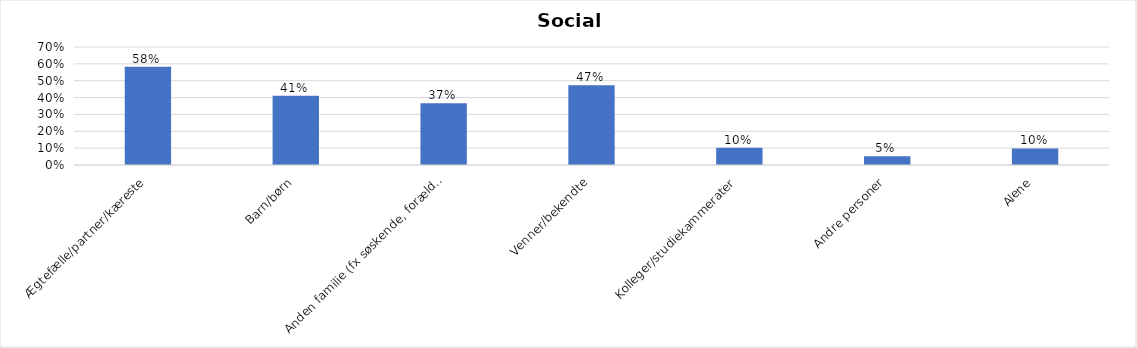
| Category | % |
|---|---|
| Ægtefælle/partner/kæreste | 0.583 |
| Barn/børn | 0.411 |
| Anden familie (fx søskende, forældre) | 0.366 |
| Venner/bekendte | 0.473 |
| Kolleger/studiekammerater | 0.102 |
| Andre personer | 0.052 |
| Alene | 0.098 |